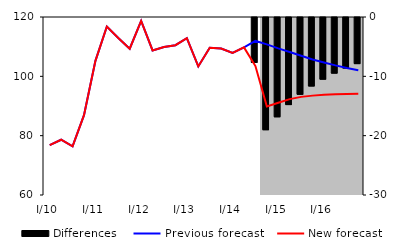
| Category | Differences |
|---|---|
| 0 | 0 |
| 1 | 0 |
| 2 | 0 |
| 3 | 0 |
| 4 | 0 |
| 5 | 0 |
| 6 | 0 |
| 7 | 0 |
| 8 | 0 |
| 9 | 0 |
| 10 | 0 |
| 11 | 0 |
| 12 | 0 |
| 13 | 0 |
| 14 | 0 |
| 15 | 0 |
| 16 | 0 |
| 17 | 0 |
| 18 | -7.571 |
| 19 | -18.914 |
| 20 | -16.735 |
| 21 | -14.676 |
| 22 | -12.946 |
| 23 | -11.546 |
| 24 | -10.398 |
| 25 | -9.375 |
| 26 | -8.52 |
| 27 | -7.772 |